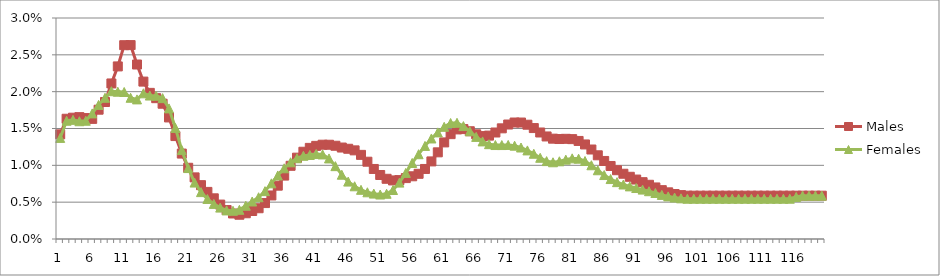
| Category | Males | Females |
|---|---|---|
| 0 | 0.014 | 0.014 |
| 1 | 0.016 | 0.016 |
| 2 | 0.016 | 0.016 |
| 3 | 0.017 | 0.016 |
| 4 | 0.016 | 0.016 |
| 5 | 0.016 | 0.017 |
| 6 | 0.018 | 0.018 |
| 7 | 0.019 | 0.019 |
| 8 | 0.021 | 0.02 |
| 9 | 0.023 | 0.02 |
| 10 | 0.026 | 0.02 |
| 11 | 0.026 | 0.019 |
| 12 | 0.024 | 0.019 |
| 13 | 0.021 | 0.02 |
| 14 | 0.02 | 0.019 |
| 15 | 0.019 | 0.019 |
| 16 | 0.018 | 0.019 |
| 17 | 0.017 | 0.018 |
| 18 | 0.014 | 0.015 |
| 19 | 0.012 | 0.012 |
| 20 | 0.01 | 0.01 |
| 21 | 0.008 | 0.008 |
| 22 | 0.007 | 0.006 |
| 23 | 0.006 | 0.005 |
| 24 | 0.006 | 0.005 |
| 25 | 0.005 | 0.004 |
| 26 | 0.004 | 0.004 |
| 27 | 0.003 | 0.004 |
| 28 | 0.003 | 0.004 |
| 29 | 0.003 | 0.005 |
| 30 | 0.004 | 0.005 |
| 31 | 0.004 | 0.006 |
| 32 | 0.005 | 0.006 |
| 33 | 0.006 | 0.008 |
| 34 | 0.007 | 0.009 |
| 35 | 0.009 | 0.01 |
| 36 | 0.01 | 0.01 |
| 37 | 0.011 | 0.011 |
| 38 | 0.012 | 0.011 |
| 39 | 0.012 | 0.011 |
| 40 | 0.013 | 0.012 |
| 41 | 0.013 | 0.011 |
| 42 | 0.013 | 0.011 |
| 43 | 0.013 | 0.01 |
| 44 | 0.012 | 0.009 |
| 45 | 0.012 | 0.008 |
| 46 | 0.012 | 0.007 |
| 47 | 0.011 | 0.007 |
| 48 | 0.01 | 0.006 |
| 49 | 0.01 | 0.006 |
| 50 | 0.009 | 0.006 |
| 51 | 0.008 | 0.006 |
| 52 | 0.008 | 0.007 |
| 53 | 0.008 | 0.008 |
| 54 | 0.008 | 0.009 |
| 55 | 0.009 | 0.01 |
| 56 | 0.009 | 0.012 |
| 57 | 0.01 | 0.013 |
| 58 | 0.011 | 0.014 |
| 59 | 0.012 | 0.014 |
| 60 | 0.013 | 0.015 |
| 61 | 0.014 | 0.016 |
| 62 | 0.015 | 0.016 |
| 63 | 0.015 | 0.015 |
| 64 | 0.015 | 0.015 |
| 65 | 0.014 | 0.014 |
| 66 | 0.014 | 0.013 |
| 67 | 0.014 | 0.013 |
| 68 | 0.014 | 0.013 |
| 69 | 0.015 | 0.013 |
| 70 | 0.016 | 0.013 |
| 71 | 0.016 | 0.013 |
| 72 | 0.016 | 0.012 |
| 73 | 0.016 | 0.012 |
| 74 | 0.015 | 0.012 |
| 75 | 0.014 | 0.011 |
| 76 | 0.014 | 0.011 |
| 77 | 0.014 | 0.01 |
| 78 | 0.014 | 0.011 |
| 79 | 0.014 | 0.011 |
| 80 | 0.014 | 0.011 |
| 81 | 0.013 | 0.011 |
| 82 | 0.013 | 0.011 |
| 83 | 0.012 | 0.01 |
| 84 | 0.011 | 0.009 |
| 85 | 0.011 | 0.009 |
| 86 | 0.01 | 0.008 |
| 87 | 0.009 | 0.008 |
| 88 | 0.009 | 0.007 |
| 89 | 0.008 | 0.007 |
| 90 | 0.008 | 0.007 |
| 91 | 0.008 | 0.007 |
| 92 | 0.007 | 0.006 |
| 93 | 0.007 | 0.006 |
| 94 | 0.007 | 0.006 |
| 95 | 0.006 | 0.006 |
| 96 | 0.006 | 0.006 |
| 97 | 0.006 | 0.006 |
| 98 | 0.006 | 0.005 |
| 99 | 0.006 | 0.005 |
| 100 | 0.006 | 0.005 |
| 101 | 0.006 | 0.005 |
| 102 | 0.006 | 0.005 |
| 103 | 0.006 | 0.005 |
| 104 | 0.006 | 0.005 |
| 105 | 0.006 | 0.005 |
| 106 | 0.006 | 0.005 |
| 107 | 0.006 | 0.005 |
| 108 | 0.006 | 0.005 |
| 109 | 0.006 | 0.005 |
| 110 | 0.006 | 0.005 |
| 111 | 0.006 | 0.005 |
| 112 | 0.006 | 0.005 |
| 113 | 0.006 | 0.005 |
| 114 | 0.006 | 0.005 |
| 115 | 0.006 | 0.006 |
| 116 | 0.006 | 0.006 |
| 117 | 0.006 | 0.006 |
| 118 | 0.006 | 0.006 |
| 119 | 0.006 | 0.006 |